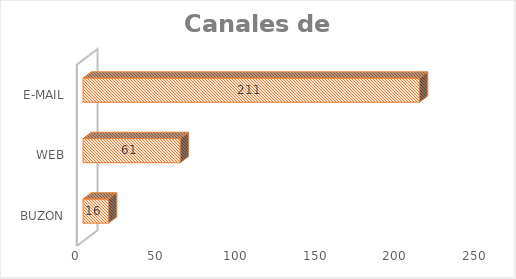
| Category | Series 0 |
|---|---|
| BUZON | 16 |
| WEB | 61 |
| E-MAIL | 211 |